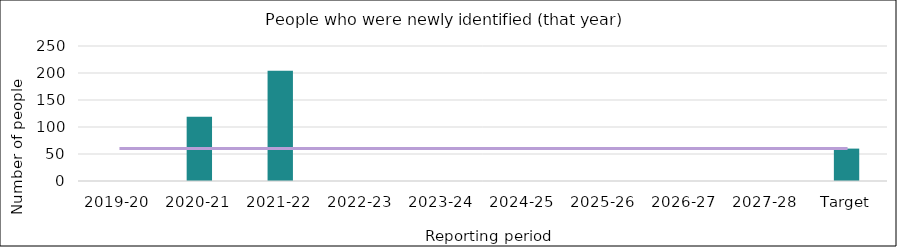
| Category | Series 0 |
|---|---|
| 2019-20 | 0 |
| 2020-21 | 119 |
| 2021-22 | 204 |
| 2022-23 | 0 |
| 2023-24 | 0 |
| 2024-25 | 0 |
| 2025-26 | 0 |
| 2026-27 | 0 |
| 2027-28 | 0 |
| Target | 60 |